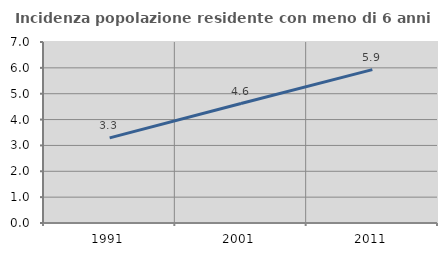
| Category | Incidenza popolazione residente con meno di 6 anni |
|---|---|
| 1991.0 | 3.291 |
| 2001.0 | 4.619 |
| 2011.0 | 5.931 |